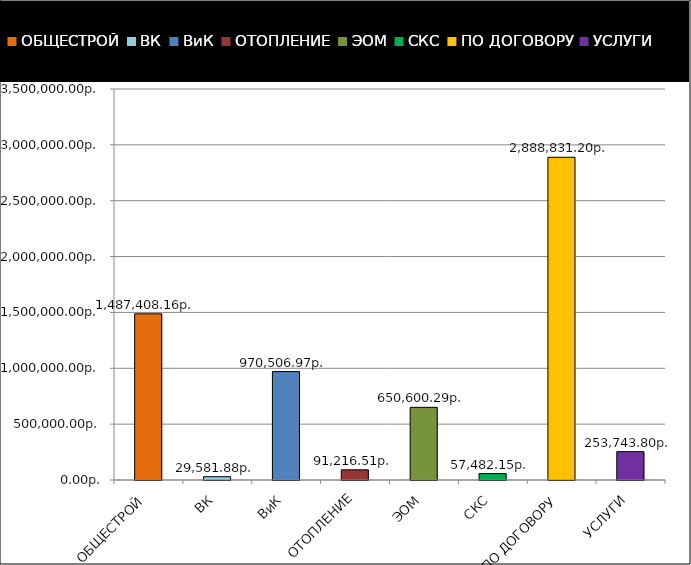
| Category | Series 0 |
|---|---|
| ОБЩЕСТРОЙ | 1487408.16 |
| ВК | 29581.88 |
| ВиК | 970506.97 |
| ОТОПЛЕНИЕ | 91216.51 |
| ЭОМ | 650600.29 |
| СКС | 57482.15 |
| ПО ДОГОВОРУ | 2888831.2 |
| УСЛУГИ | 253743.8 |